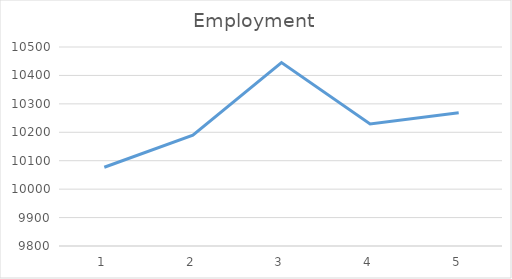
| Category | Series 0 |
|---|---|
| 0 | 10077 |
| 1 | 10190 |
| 2 | 10445 |
| 3 | 10229 |
| 4 | 10269 |